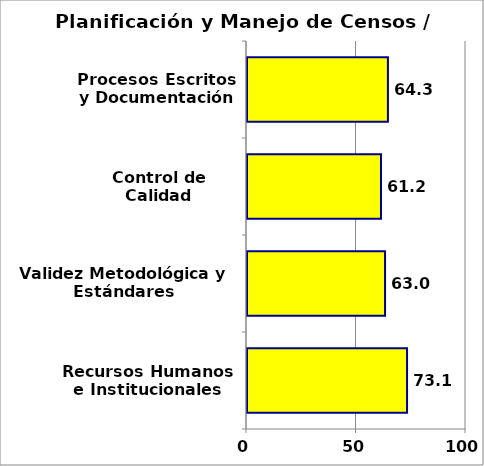
| Category | Series 0 |
|---|---|
| Recursos Humanos e Institucionales | 73.081 |
| Validez Metodológica y Estándares Internacionales | 63.037 |
| Control de Calidad | 61.181 |
| Procesos Escritos y Documentación | 64.345 |